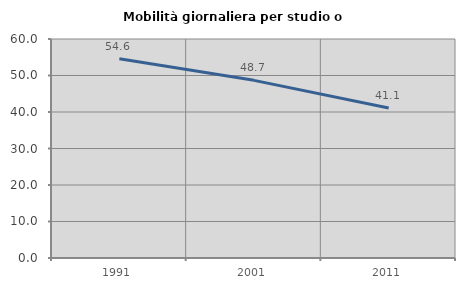
| Category | Mobilità giornaliera per studio o lavoro |
|---|---|
| 1991.0 | 54.585 |
| 2001.0 | 48.673 |
| 2011.0 | 41.076 |